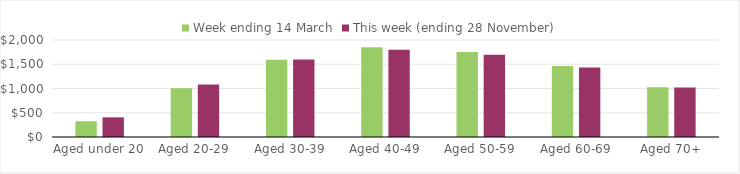
| Category | Week ending 14 March | This week (ending 28 November) |
|---|---|---|
| Aged under 20 | 324.02 | 405.32 |
| Aged 20-29 | 1004.99 | 1082.58 |
| Aged 30-39 | 1590.37 | 1596.45 |
| Aged 40-49 | 1851.35 | 1797.95 |
| Aged 50-59 | 1754.54 | 1697.59 |
| Aged 60-69 | 1464.95 | 1431.85 |
| Aged 70+ | 1025.87 | 1019.06 |